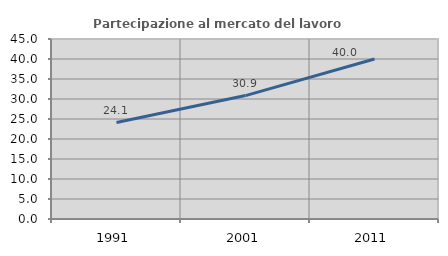
| Category | Partecipazione al mercato del lavoro  femminile |
|---|---|
| 1991.0 | 24.103 |
| 2001.0 | 30.856 |
| 2011.0 | 40 |